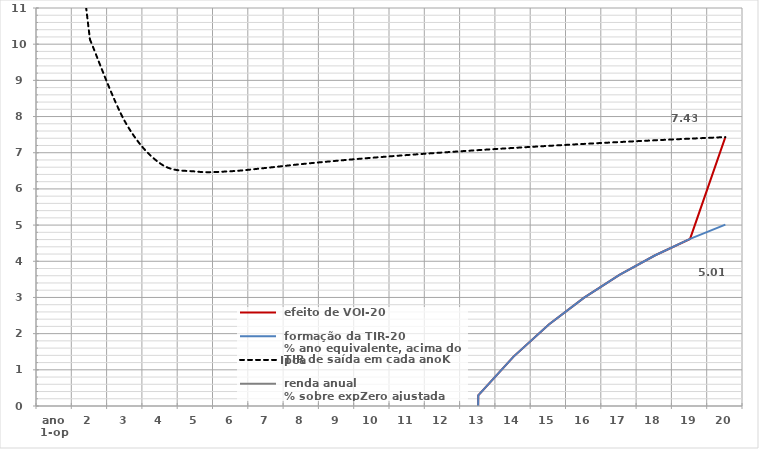
| Category |  efeito de VOI-20 |  formação da TIR-20
 % ano equivalente, acima do Ipca |  TIR de saída em cada anoK |  renda anual
 % sobre expZero ajustada |
|---|---|---|---|---|
| ano
1-op | -100 | -100 | 18.289 |  |
| 2 | -100 | -100 | 10.13 |  |
| 3 | -100 | -100 | 7.847 |  |
| 4 | -100 | -100 | 6.697 |  |
| 5 | -100 | -100 | 6.48 |  |
| 6 | -100 | -100 | 6.489 |  |
| 7 | -100 | -100 | 6.582 |  |
| 8 | -100 | -100 | 6.687 |  |
| 9 | -100 | -100 | 6.779 |  |
| 10 | -100 | -100 | 6.862 |  |
| 11 | -100 | -100 | 6.937 |  |
| 12 | -100 | -100 | 7.007 |  |
| 13 | 0.295 | 0.295 | 7.072 |  |
| 14 | 1.365 | 1.365 | 7.133 |  |
| 15 | 2.253 | 2.253 | 7.19 |  |
| 16 | 2.996 | 2.996 | 7.244 |  |
| 17 | 3.625 | 3.625 | 7.295 |  |
| 18 | 4.159 | 4.159 | 7.343 |  |
| 19 | 4.617 | 4.617 | 7.389 |  |
| 20 | 7.432 | 5.012 | 7.432 |  |